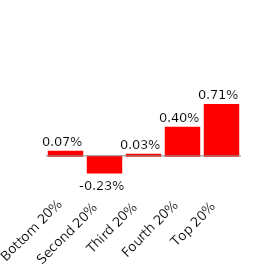
| Category | Series 0 |
|---|---|
| Bottom 20% | 0.001 |
| Second 20% | -0.002 |
| Third 20% | 0 |
| Fourth 20% | 0.004 |
| Top 20% | 0.007 |